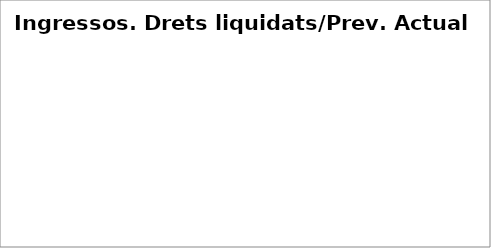
| Category | Series 0 |
|---|---|
| Impostos directes | 0.366 |
| Impostos indirectes | 0.361 |
| Taxes, preus públics i altres ingressos | 0.196 |
| Transferències corrents | 0.316 |
| Ingressos patrimonials | 0.229 |
| Venda d'inversions reals | 0.124 |
| Transferències de capital | 0.062 |
| Actius financers* | 0 |
| Passius financers | 0.006 |